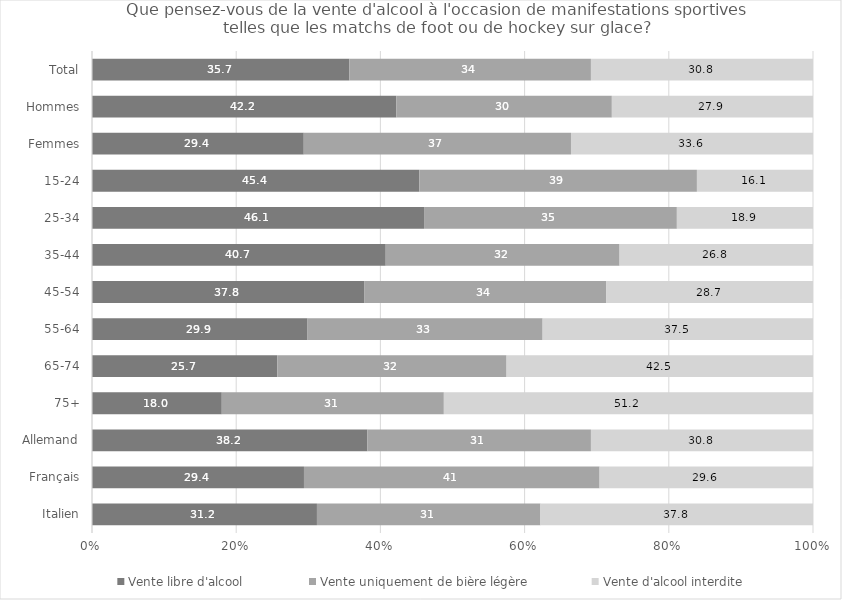
| Category | Vente libre d'alcool | Vente uniquement de bière légère | Vente d'alcool interdite |
|---|---|---|---|
| Total | 35.7 | 33.5 | 30.8 |
| Hommes | 42.2 | 29.9 | 27.9 |
| Femmes | 29.4 | 37.1 | 33.6 |
| 15-24 | 45.4 | 38.5 | 16.1 |
| 25-34 | 46.1 | 35.1 | 18.9 |
| 35-44 | 40.7 | 32.4 | 26.8 |
| 45-54 | 37.8 | 33.5 | 28.7 |
| 55-64 | 29.9 | 32.6 | 37.5 |
| 65-74 | 25.7 | 31.8 | 42.5 |
| 75+ | 18 | 30.8 | 51.2 |
| Allemand | 38.2 | 31 | 30.8 |
| Français | 29.4 | 41 | 29.6 |
| Italien | 31.2 | 31 | 37.8 |